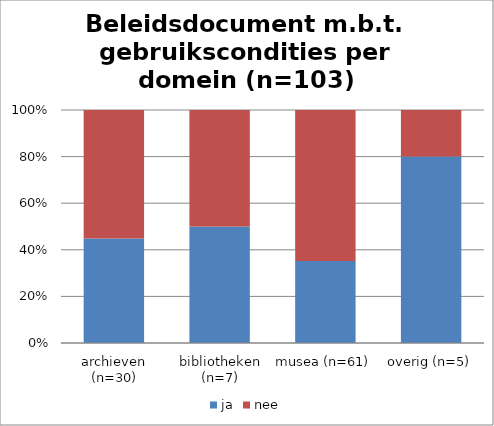
| Category | ja | nee |
|---|---|---|
| archieven (n=30) | 13 | 16 |
| bibliotheken (n=7) | 3 | 3 |
| musea (n=61) | 19 | 35 |
| overig (n=5) | 4 | 1 |